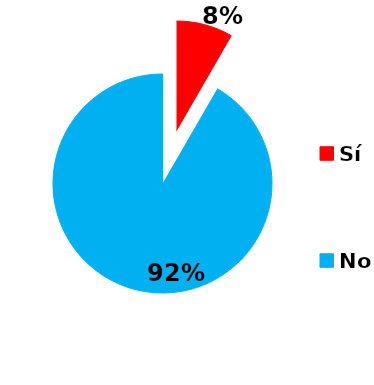
| Category | Series 0 |
|---|---|
| Sí | 1 |
| No | 11 |